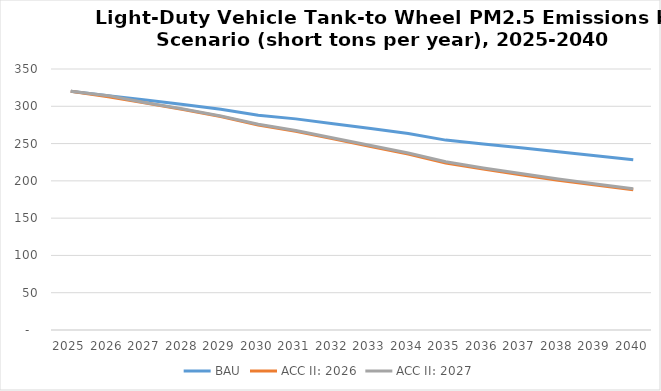
| Category | BAU | ACC II: 2026 | ACC II: 2027 |
|---|---|---|---|
| 2025.0 | 320.022 | 320.022 | 320.022 |
| 2026.0 | 314.263 | 312.63 | 314.263 |
| 2027.0 | 308.491 | 304.546 | 304.832 |
| 2028.0 | 302.423 | 295.795 | 296.261 |
| 2029.0 | 296.046 | 286.349 | 287.01 |
| 2030.0 | 288.034 | 275.032 | 275.886 |
| 2031.0 | 283.121 | 266.425 | 267.475 |
| 2032.0 | 276.714 | 256.336 | 257.556 |
| 2033.0 | 270.117 | 246.128 | 247.486 |
| 2034.0 | 263.378 | 235.914 | 237.374 |
| 2035.0 | 254.633 | 224.074 | 225.59 |
| 2036.0 | 249.447 | 215.82 | 217.364 |
| 2037.0 | 244.272 | 208.238 | 209.759 |
| 2038.0 | 238.969 | 200.945 | 202.41 |
| 2039.0 | 233.758 | 194.333 | 195.694 |
| 2040.0 | 228.438 | 188.087 | 189.302 |